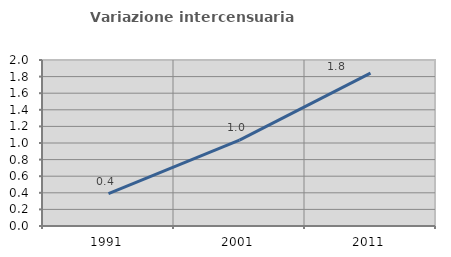
| Category | Variazione intercensuaria annua |
|---|---|
| 1991.0 | 0.391 |
| 2001.0 | 1.035 |
| 2011.0 | 1.843 |